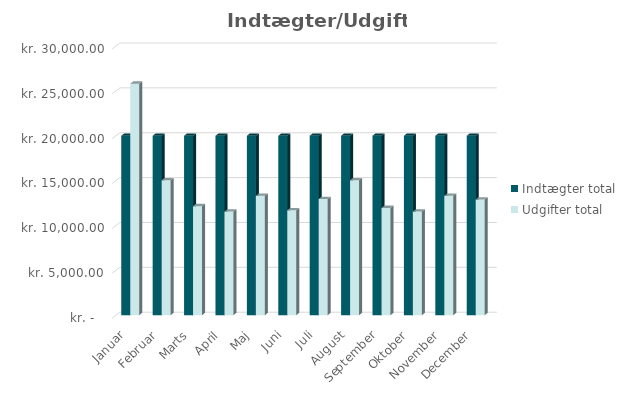
| Category | Indtægter total | Udgifter total |
|---|---|---|
| Januar | 20000 | 25800 |
| Februar | 20000 | 15040 |
| Marts | 20000 | 12150 |
| April | 20000 | 11540 |
| Maj | 20000 | 13300 |
| Juni | 20000 | 11690 |
| Juli | 20000 | 12950 |
| August | 20000 | 15040 |
| September | 20000 | 11950 |
| Oktober | 20000 | 11540 |
| November | 20000 | 13300 |
| December | 20000 | 12890 |